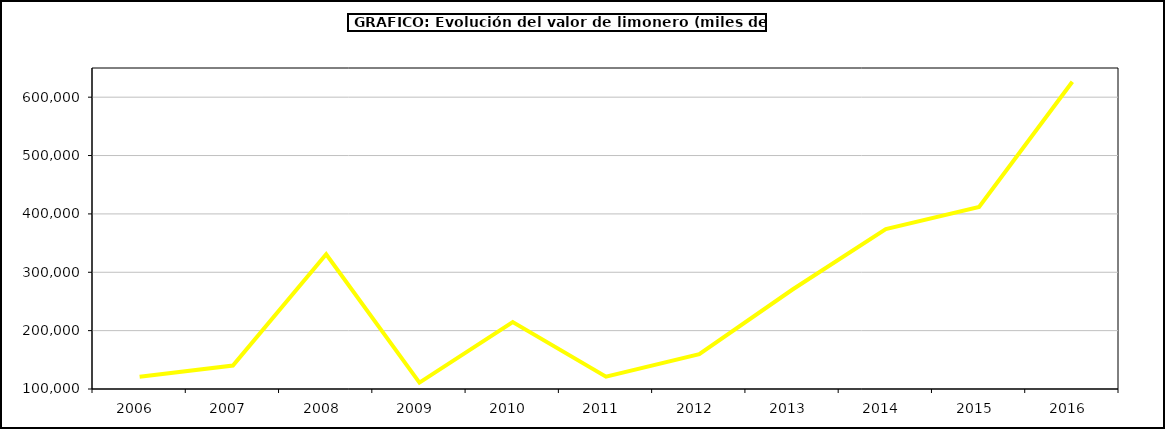
| Category | Valor |
|---|---|
| 2006.0 | 121132.205 |
| 2007.0 | 140203.613 |
| 2008.0 | 330828.422 |
| 2009.0 | 110910.366 |
| 2010.0 | 214653.894 |
| 2011.0 | 121030.951 |
| 2012.0 | 159689.894 |
| 2013.0 | 270510.614 |
| 2014.0 | 373950.238 |
| 2015.0 | 411737 |
| 2016.0 | 626329 |